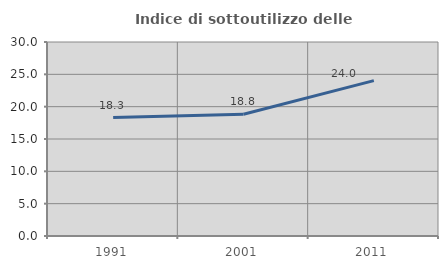
| Category | Indice di sottoutilizzo delle abitazioni  |
|---|---|
| 1991.0 | 18.31 |
| 2001.0 | 18.834 |
| 2011.0 | 24.034 |